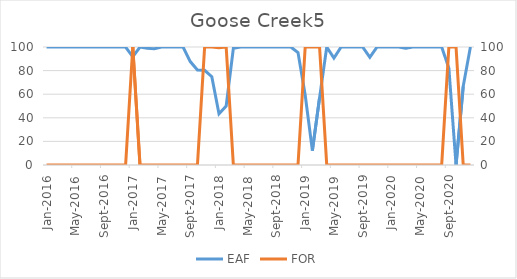
| Category | EAF |
|---|---|
| 2016-01-01 | 100 |
| 2016-02-01 | 100 |
| 2016-03-01 | 100 |
| 2016-04-01 | 100 |
| 2016-05-01 | 100 |
| 2016-06-01 | 100 |
| 2016-07-01 | 100 |
| 2016-08-01 | 100 |
| 2016-09-01 | 100 |
| 2016-10-01 | 100 |
| 2016-11-01 | 100 |
| 2016-12-01 | 100 |
| 2017-01-01 | 91.67 |
| 2017-02-01 | 100 |
| 2017-03-01 | 98.84 |
| 2017-04-01 | 98.49 |
| 2017-05-01 | 100 |
| 2017-06-01 | 100 |
| 2017-07-01 | 100 |
| 2017-08-01 | 100 |
| 2017-09-01 | 87.65 |
| 2017-10-01 | 80.58 |
| 2017-11-01 | 80.25 |
| 2017-12-01 | 74.8 |
| 2018-01-01 | 43.42 |
| 2018-02-01 | 50 |
| 2018-03-01 | 98.83 |
| 2018-04-01 | 100 |
| 2018-05-01 | 100 |
| 2018-06-01 | 100 |
| 2018-07-01 | 100 |
| 2018-08-01 | 100 |
| 2018-09-01 | 100 |
| 2018-10-01 | 100 |
| 2018-11-01 | 100 |
| 2018-12-01 | 95.27 |
| 2019-01-01 | 59.27 |
| 2019-02-01 | 12.2 |
| 2019-03-01 | 56.93 |
| 2019-04-01 | 100 |
| 2019-05-01 | 90.6 |
| 2019-06-01 | 100 |
| 2019-07-01 | 100 |
| 2019-08-01 | 100 |
| 2019-09-01 | 100 |
| 2019-10-01 | 91.27 |
| 2019-11-01 | 100 |
| 2019-12-01 | 100 |
| 2020-01-01 | 100 |
| 2020-02-01 | 100 |
| 2020-03-01 | 98.93 |
| 2020-04-01 | 100 |
| 2020-05-01 | 100 |
| 2020-06-01 | 100 |
| 2020-07-01 | 100 |
| 2020-08-01 | 100 |
| 2020-09-01 | 82.16 |
| 2020-10-01 | 0 |
| 2020-11-01 | 66.7 |
| 2020-12-01 | 100 |